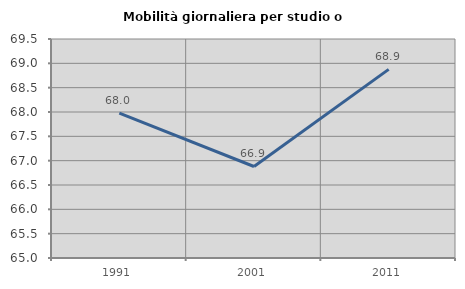
| Category | Mobilità giornaliera per studio o lavoro |
|---|---|
| 1991.0 | 67.978 |
| 2001.0 | 66.88 |
| 2011.0 | 68.875 |